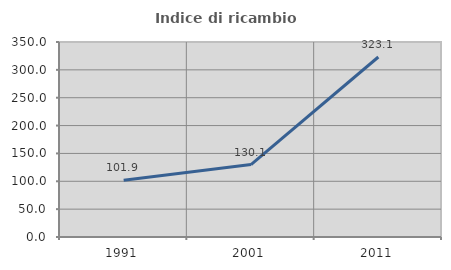
| Category | Indice di ricambio occupazionale  |
|---|---|
| 1991.0 | 101.932 |
| 2001.0 | 130.086 |
| 2011.0 | 323.077 |